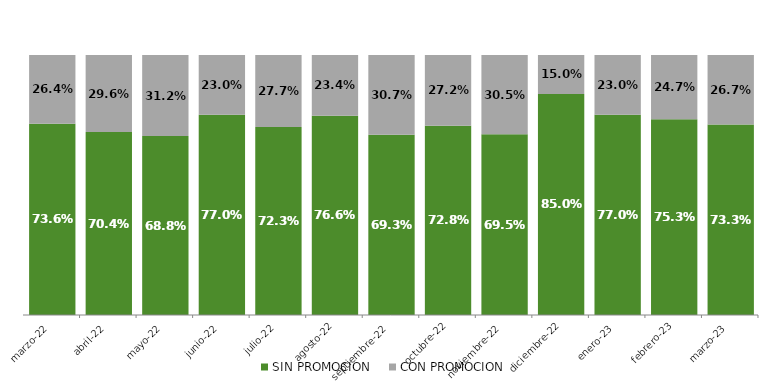
| Category | SIN PROMOCION   | CON PROMOCION   |
|---|---|---|
| 2022-03-01 | 0.736 | 0.264 |
| 2022-04-01 | 0.704 | 0.296 |
| 2022-05-01 | 0.688 | 0.312 |
| 2022-06-01 | 0.77 | 0.23 |
| 2022-07-01 | 0.723 | 0.277 |
| 2022-08-01 | 0.766 | 0.234 |
| 2022-09-01 | 0.693 | 0.307 |
| 2022-10-01 | 0.728 | 0.272 |
| 2022-11-01 | 0.695 | 0.305 |
| 2022-12-01 | 0.85 | 0.15 |
| 2023-01-01 | 0.77 | 0.23 |
| 2023-02-01 | 0.753 | 0.247 |
| 2023-03-01 | 0.733 | 0.267 |